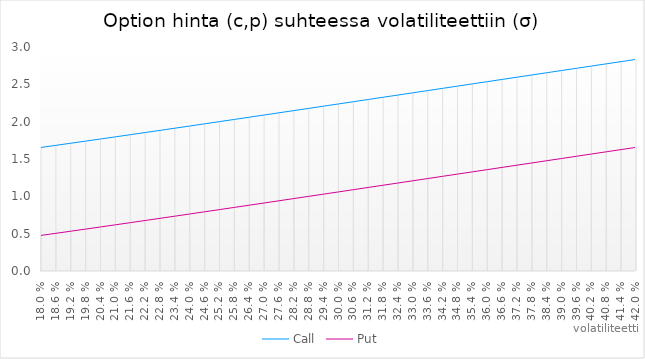
| Category | Call | Put |
|---|---|---|
| 0.17999999999999988 | 1.655 | 0.477 |
| 0.1859999999999999 | 1.683 | 0.505 |
| 0.1919999999999999 | 1.711 | 0.533 |
| 0.1979999999999999 | 1.739 | 0.561 |
| 0.2039999999999999 | 1.768 | 0.59 |
| 0.2099999999999999 | 1.797 | 0.618 |
| 0.21599999999999991 | 1.826 | 0.647 |
| 0.22199999999999992 | 1.854 | 0.676 |
| 0.22799999999999992 | 1.883 | 0.705 |
| 0.23399999999999993 | 1.913 | 0.734 |
| 0.23999999999999994 | 1.942 | 0.764 |
| 0.24599999999999994 | 1.971 | 0.793 |
| 0.25199999999999995 | 2.001 | 0.822 |
| 0.25799999999999995 | 2.03 | 0.852 |
| 0.26399999999999996 | 2.06 | 0.881 |
| 0.26999999999999996 | 2.089 | 0.911 |
| 0.27599999999999997 | 2.119 | 0.94 |
| 0.282 | 2.148 | 0.97 |
| 0.288 | 2.178 | 1 |
| 0.294 | 2.208 | 1.03 |
| 0.3 | 2.237 | 1.059 |
| 0.306 | 2.267 | 1.089 |
| 0.312 | 2.297 | 1.119 |
| 0.318 | 2.327 | 1.149 |
| 0.324 | 2.357 | 1.178 |
| 0.33 | 2.387 | 1.208 |
| 0.336 | 2.416 | 1.238 |
| 0.342 | 2.446 | 1.268 |
| 0.34800000000000003 | 2.476 | 1.298 |
| 0.35400000000000004 | 2.506 | 1.328 |
| 0.36000000000000004 | 2.536 | 1.358 |
| 0.36600000000000005 | 2.566 | 1.387 |
| 0.37200000000000005 | 2.596 | 1.417 |
| 0.37800000000000006 | 2.625 | 1.447 |
| 0.38400000000000006 | 2.655 | 1.477 |
| 0.39000000000000007 | 2.685 | 1.507 |
| 0.3960000000000001 | 2.715 | 1.537 |
| 0.4020000000000001 | 2.745 | 1.566 |
| 0.4080000000000001 | 2.774 | 1.596 |
| 0.4140000000000001 | 2.804 | 1.626 |
| 0.4200000000000001 | 2.834 | 1.656 |